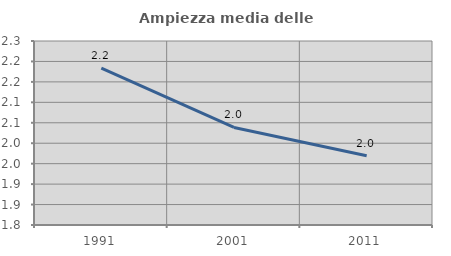
| Category | Ampiezza media delle famiglie |
|---|---|
| 1991.0 | 2.183 |
| 2001.0 | 2.039 |
| 2011.0 | 1.97 |